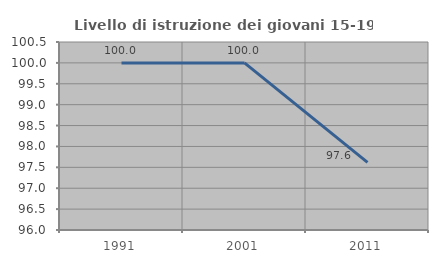
| Category | Livello di istruzione dei giovani 15-19 anni |
|---|---|
| 1991.0 | 100 |
| 2001.0 | 100 |
| 2011.0 | 97.619 |